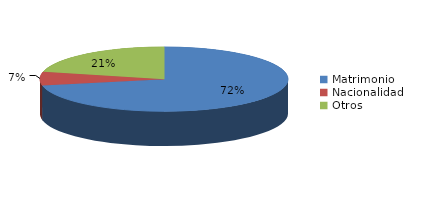
| Category | Series 0 |
|---|---|
| Matrimonio | 2457 |
| Nacionalidad | 236 |
| Otros | 727 |